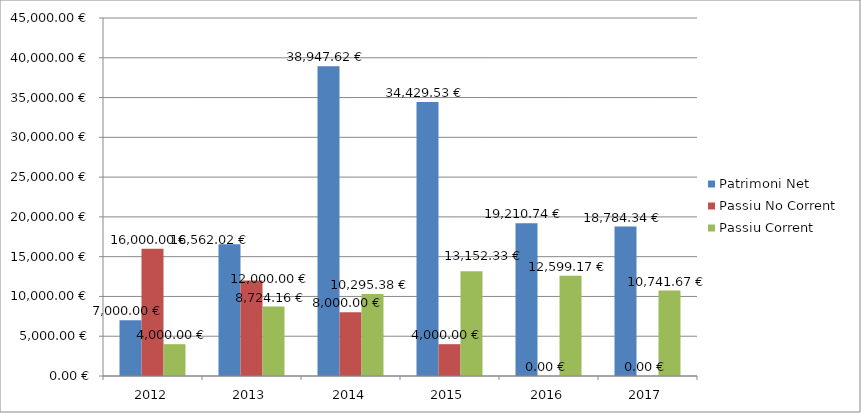
| Category | Patrimoni Net | Passiu No Corrent | Passiu Corrent |
|---|---|---|---|
| 2012.0 | 7000 | 16000 | 4000 |
| 2013.0 | 16562.02 | 12000 | 8724.16 |
| 2014.0 | 38947.617 | 8000 | 10295.38 |
| 2015.0 | 34429.53 | 4000 | 13152.33 |
| 2016.0 | 19210.744 | 0 | 12599.17 |
| 2017.0 | 18784.338 | 0 | 10741.67 |